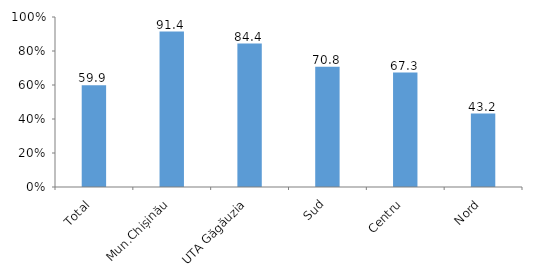
| Category | Series 0 |
|---|---|
| Total | 59.9 |
| Mun.Chișinău | 91.4 |
| UTA Găgăuzia | 84.4 |
| Sud | 70.8 |
| Centru | 67.3 |
| Nord | 43.2 |